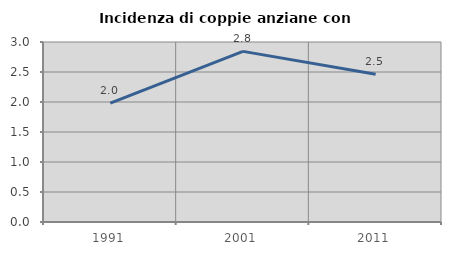
| Category | Incidenza di coppie anziane con figli |
|---|---|
| 1991.0 | 1.982 |
| 2001.0 | 2.844 |
| 2011.0 | 2.463 |